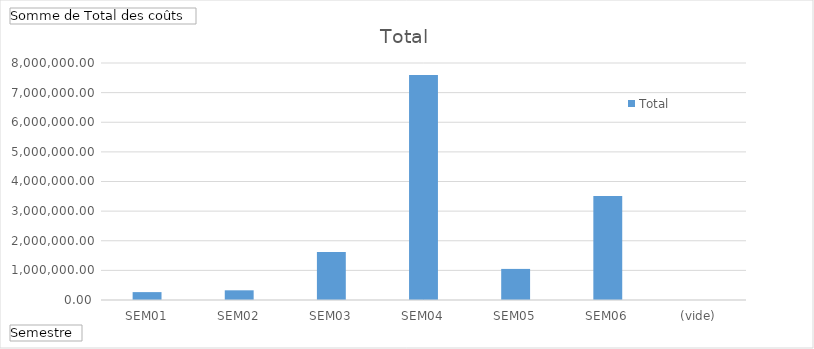
| Category | Total |
|---|---|
| SEM01 | 266200 |
| SEM02 | 327000 |
| SEM03 | 1617640 |
| SEM04 | 7596360 |
| SEM05 | 1049440 |
| SEM06 | 3506480 |
| (vide) | 0 |